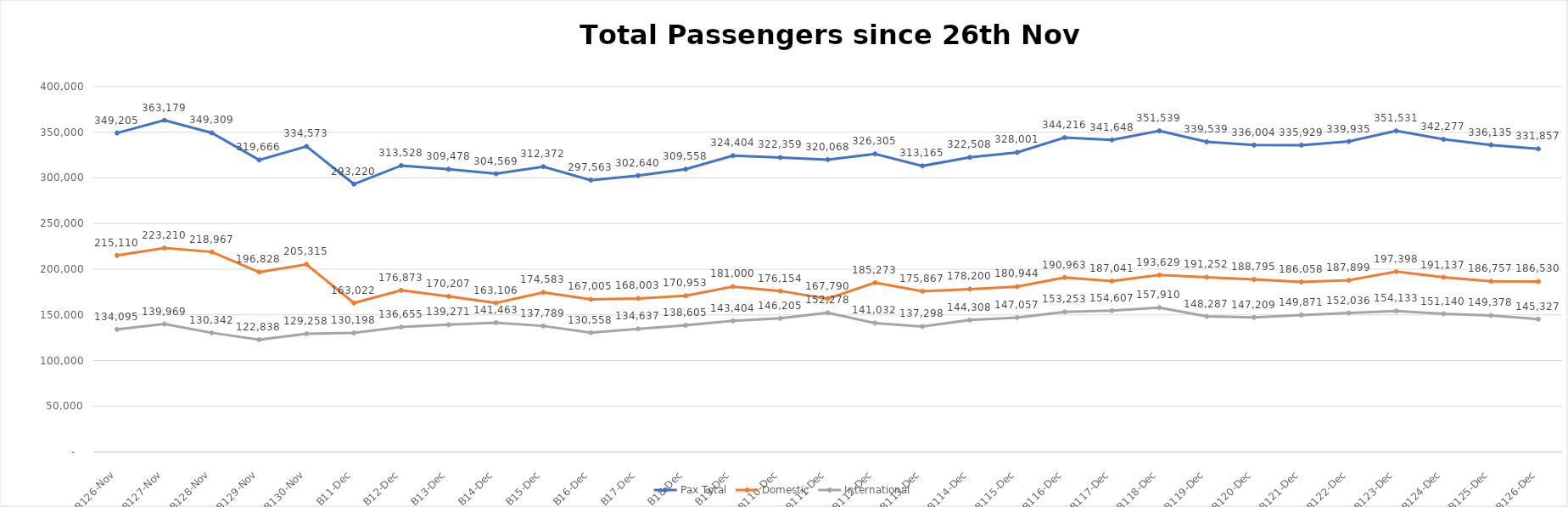
| Category | Pax Total |  Domestic  |  International  |
|---|---|---|---|
| 2022-11-26 | 349205 | 215110 | 134095 |
| 2022-11-27 | 363179 | 223210 | 139969 |
| 2022-11-28 | 349309 | 218967 | 130342 |
| 2022-11-29 | 319666 | 196828 | 122838 |
| 2022-11-30 | 334573 | 205315 | 129258 |
| 2022-12-01 | 293220 | 163022 | 130198 |
| 2022-12-02 | 313528 | 176873 | 136655 |
| 2022-12-03 | 309478 | 170207 | 139271 |
| 2022-12-04 | 304569 | 163106 | 141463 |
| 2022-12-05 | 312372 | 174583 | 137789 |
| 2022-12-06 | 297563 | 167005 | 130558 |
| 2022-12-07 | 302640 | 168003 | 134637 |
| 2022-12-08 | 309558 | 170953 | 138605 |
| 2022-12-09 | 324404 | 181000 | 143404 |
| 2022-12-10 | 322359 | 176154 | 146205 |
| 2022-12-11 | 320068 | 167790 | 152278 |
| 2022-12-12 | 326305 | 185273 | 141032 |
| 2022-12-13 | 313165 | 175867 | 137298 |
| 2022-12-14 | 322508 | 178200 | 144308 |
| 2022-12-15 | 328001 | 180944 | 147057 |
| 2022-12-16 | 344216 | 190963 | 153253 |
| 2022-12-17 | 341648 | 187041 | 154607 |
| 2022-12-18 | 351539 | 193629 | 157910 |
| 2022-12-19 | 339539 | 191252 | 148287 |
| 2022-12-20 | 336004 | 188795 | 147209 |
| 2022-12-21 | 335929 | 186058 | 149871 |
| 2022-12-22 | 339935 | 187899 | 152036 |
| 2022-12-23 | 351531 | 197398 | 154133 |
| 2022-12-24 | 342277 | 191137 | 151140 |
| 2022-12-25 | 336135 | 186757 | 149378 |
| 2022-12-26 | 331857 | 186530 | 145327 |